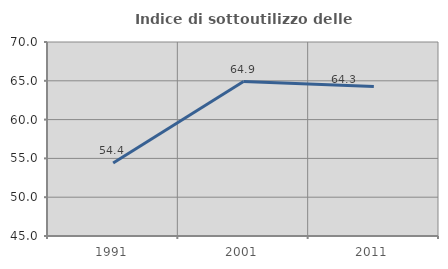
| Category | Indice di sottoutilizzo delle abitazioni  |
|---|---|
| 1991.0 | 54.412 |
| 2001.0 | 64.897 |
| 2011.0 | 64.264 |